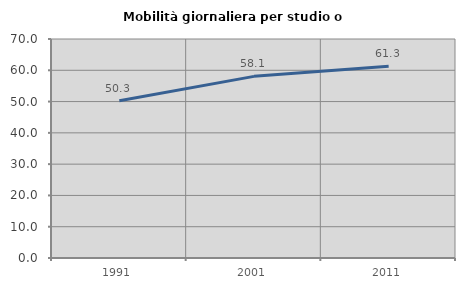
| Category | Mobilità giornaliera per studio o lavoro |
|---|---|
| 1991.0 | 50.257 |
| 2001.0 | 58.058 |
| 2011.0 | 61.288 |